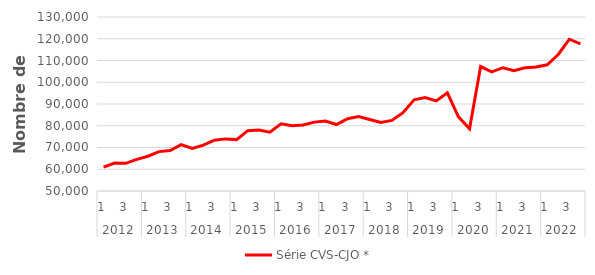
| Category | Série CVS-CJO * |
|---|---|
| 0 | 60977.588 |
| 1 | 62856.471 |
| 2 | 62717.775 |
| 3 | 64516.187 |
| 4 | 65973.676 |
| 5 | 68106.728 |
| 6 | 68602.009 |
| 7 | 71293.904 |
| 8 | 69571.756 |
| 9 | 71084.181 |
| 10 | 73381.234 |
| 11 | 73962.819 |
| 12 | 73634.032 |
| 13 | 77742.91 |
| 14 | 78079.835 |
| 15 | 77035.349 |
| 16 | 80855.829 |
| 17 | 79987.101 |
| 18 | 80351.39 |
| 19 | 81673.28 |
| 20 | 82200.685 |
| 21 | 80555.075 |
| 22 | 83206.998 |
| 23 | 84224.784 |
| 24 | 82895.808 |
| 25 | 81489.341 |
| 26 | 82465.385 |
| 27 | 86037.262 |
| 28 | 91925.358 |
| 29 | 92958.634 |
| 30 | 91436.968 |
| 31 | 95160.939 |
| 32 | 84107.109 |
| 33 | 78649.237 |
| 34 | 107220.849 |
| 35 | 104737.671 |
| 36 | 106684.201 |
| 37 | 105350.006 |
| 38 | 106679.109 |
| 39 | 107015.421 |
| 40 | 108027.438 |
| 41 | 112768.561 |
| 42 | 119785.824 |
| 43 | 117667.153 |